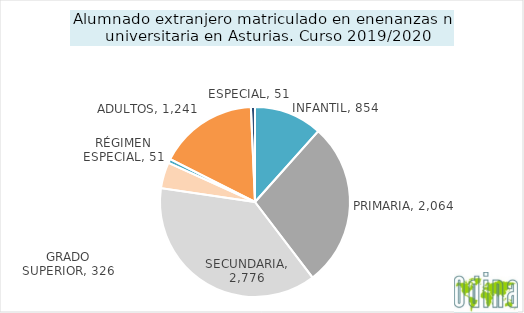
| Category | TOTAL |
|---|---|
| INFANTIL | 854 |
| PRIMARIA | 2064 |
| SECUNDARIA | 2776 |
| GRADO SUPERIOR | 326 |
| RÉGIMEN ESPECIAL | 51 |
| ADULTOS | 1241 |
| ESPECIAL | 51 |